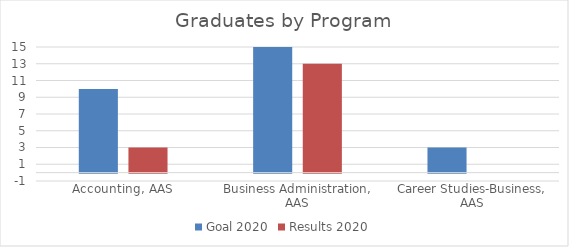
| Category | Goal 2020 | Results 2020 |
|---|---|---|
| Accounting, AAS | 10 | 3 |
| Business Administration, AAS | 15 | 13 |
| Career Studies-Business, AAS | 3 | 0 |